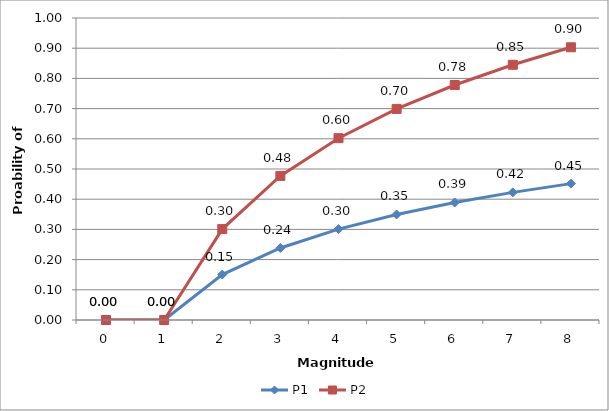
| Category | P1 | P2 |
|---|---|---|
| 0.0 | 0 | 0 |
| 1.0 | 0 | 0 |
| 2.0 | 0.151 | 0.301 |
| 3.0 | 0.239 | 0.477 |
| 4.0 | 0.301 | 0.602 |
| 5.0 | 0.349 | 0.699 |
| 6.0 | 0.389 | 0.778 |
| 7.0 | 0.423 | 0.845 |
| 8.0 | 0.452 | 0.903 |